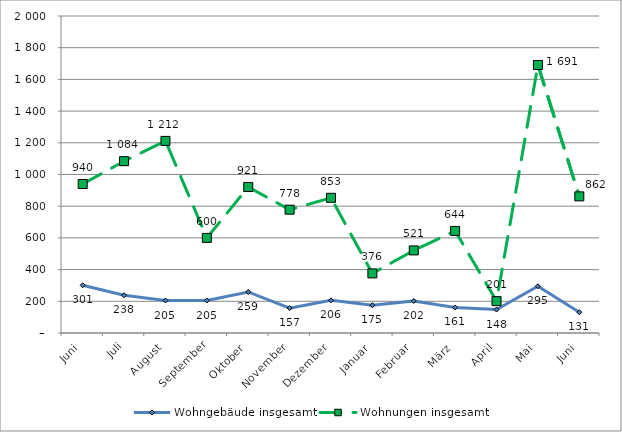
| Category | Wohngebäude insgesamt | Wohnungen insgesamt |
|---|---|---|
| Juni | 301 | 940 |
| Juli | 238 | 1084 |
| August | 205 | 1212 |
| September | 205 | 600 |
| Oktober | 259 | 921 |
| November | 157 | 778 |
| Dezember | 206 | 853 |
| Januar | 175 | 376 |
| Februar | 202 | 521 |
| März | 161 | 644 |
| April | 148 | 201 |
| Mai | 295 | 1691 |
| Juni | 131 | 862 |